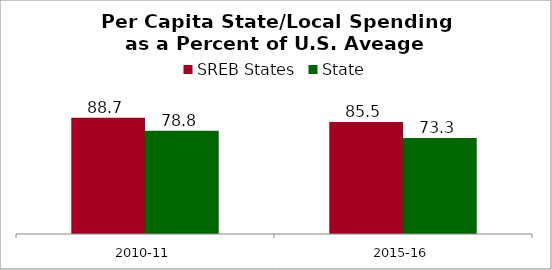
| Category | SREB States | State |
|---|---|---|
| 2010-11 | 88.672 | 78.806 |
| 2015-16 | 85.516 | 73.323 |